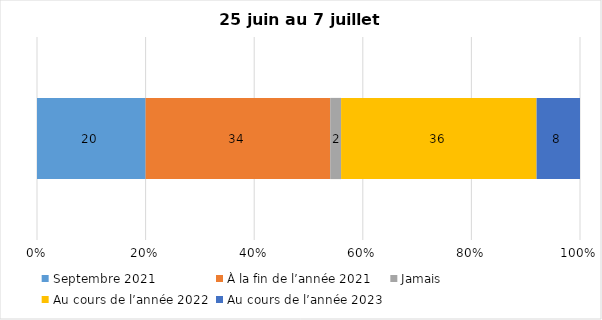
| Category | Septembre 2021 | À la fin de l’année 2021 | Jamais | Au cours de l’année 2022 | Au cours de l’année 2023 |
|---|---|---|---|---|---|
| 0 | 20 | 34 | 2 | 36 | 8 |